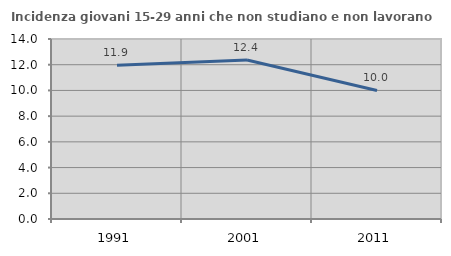
| Category | Incidenza giovani 15-29 anni che non studiano e non lavorano  |
|---|---|
| 1991.0 | 11.95 |
| 2001.0 | 12.371 |
| 2011.0 | 10 |